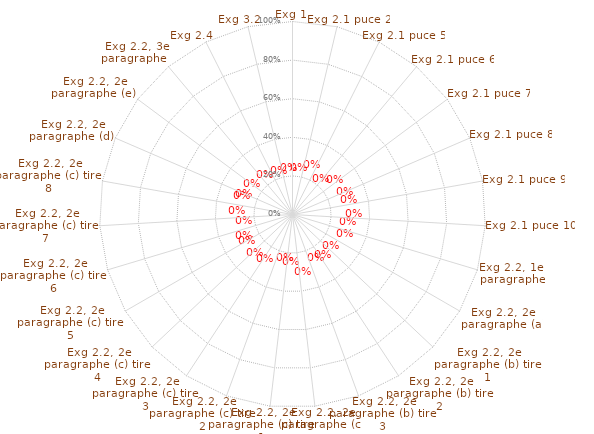
| Category | Annexe IX - 2017/746 |
|---|---|
| Exg 1 | 0 |
| Exg 2.1 puce 2 | 0 |
| Exg 2.1 puce 5 | 0 |
| Exg 2.1 puce 6 | 0 |
| Exg 2.1 puce 7 | 0 |
| Exg 2.1 puce 8 | 0 |
| Exg 2.1 puce 9 | 0 |
| Exg 2.1 puce 10 | 0 |
| Exg 2.2, 1er paragraphe | 0 |
| Exg 2.2, 2e paragraphe (a) | 0 |
| Exg 2.2, 2e paragraphe (b) tiret 1 | 0 |
| Exg 2.2, 2e paragraphe (b) tiret 2 | 0 |
| Exg 2.2, 2e paragraphe (b) tiret 3 | 0 |
| Exg 2.2, 2e paragraphe (c) | 0 |
| Exg 2.2, 2e paragraphe (c) tiret 1 | 0 |
| Exg 2.2, 2e paragraphe (c) tiret 2 | 0 |
| Exg 2.2, 2e paragraphe (c) tiret 3 | 0 |
| Exg 2.2, 2e paragraphe (c) tiret 4 | 0 |
| Exg 2.2, 2e paragraphe (c) tiret 5 | 0 |
| Exg 2.2, 2e paragraphe (c) tiret 6 | 0 |
| Exg 2.2, 2e paragraphe (c) tiret 7 | 0 |
| Exg 2.2, 2e paragraphe (c) tiret 8 | 0 |
| Exg 2.2, 2e paragraphe (d)  | 0 |
| Exg 2.2, 2e paragraphe (e)  | 0 |
| Exg 2.2, 3e paragraphe   | 0 |
| Exg 2.4 | 0 |
| Exg 3.2 | 0 |